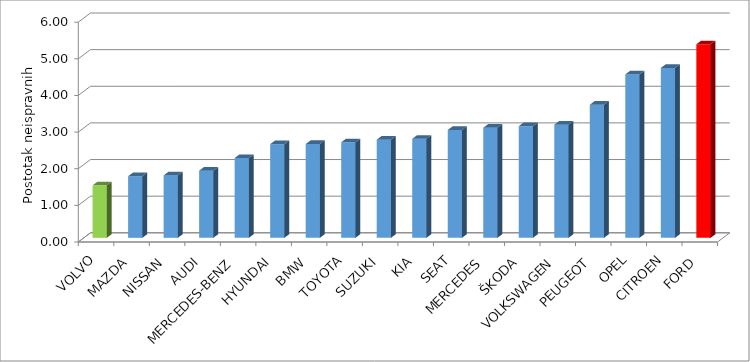
| Category | Series 4 |
|---|---|
| VOLVO | 1.432 |
| MAZDA | 1.682 |
| NISSAN | 1.703 |
| AUDI | 1.833 |
| MERCEDES-BENZ | 2.178 |
| HYUNDAI | 2.556 |
| BMW | 2.56 |
| TOYOTA | 2.608 |
| SUZUKI | 2.679 |
| KIA | 2.702 |
| SEAT | 2.942 |
| MERCEDES | 3.004 |
| ŠKODA | 3.049 |
| VOLKSWAGEN | 3.087 |
| PEUGEOT | 3.632 |
| OPEL | 4.461 |
| CITROEN | 4.637 |
| FORD | 5.283 |